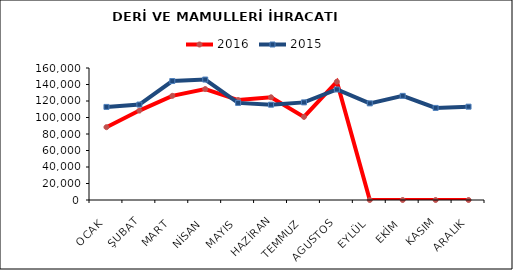
| Category | 2016 | 2015 |
|---|---|---|
| OCAK | 88262.908 | 112829.788 |
| ŞUBAT | 108393.575 | 115694.139 |
| MART | 126259.208 | 144207.135 |
| NİSAN | 134442.775 | 145988.647 |
| MAYIS | 121184.22 | 117697.773 |
| HAZİRAN | 124471.933 | 115520.333 |
| TEMMUZ | 100768.006 | 118325.168 |
| AGUSTOS | 143410.301 | 133966.966 |
| EYLÜL | 0 | 117142.709 |
| EKİM | 0 | 126212.522 |
| KASIM | 0 | 111617.977 |
| ARALIK | 0 | 113137.721 |